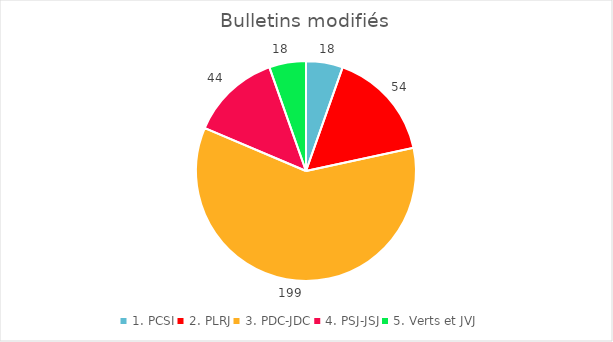
| Category | Series 0 |
|---|---|
| 1. PCSI | 18 |
| 2. PLRJ | 54 |
| 3. PDC-JDC | 199 |
| 4. PSJ-JSJ | 44 |
| 5. Verts et JVJ | 18 |